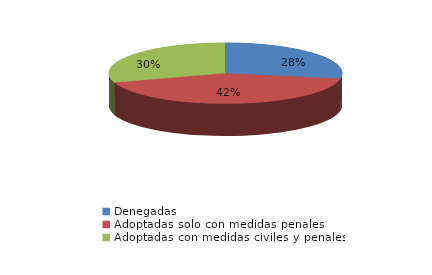
| Category | Series 0 |
|---|---|
| Denegadas | 25 |
| Adoptadas solo con medidas penales | 38 |
| Adoptadas con medidas civiles y penales | 27 |
| Adoptadas con medidas civiles | 0 |